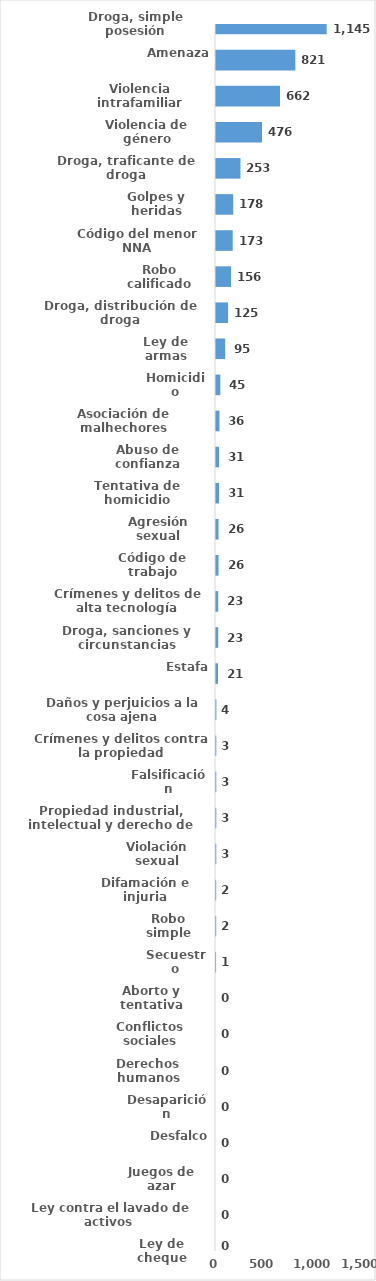
| Category | Series 0 |
|---|---|
| Droga, simple posesión | 1145 |
| Amenaza | 821 |
| Violencia intrafamiliar | 662 |
| Violencia de género | 476 |
| Droga, traficante de droga | 253 |
| Golpes y heridas | 178 |
| Código del menor NNA | 173 |
| Robo calificado | 156 |
| Droga, distribución de droga | 125 |
| Ley de armas | 95 |
| Homicidio | 45 |
| Asociación de malhechores | 36 |
| Abuso de confianza | 31 |
| Tentativa de homicidio | 31 |
| Agresión sexual | 26 |
| Código de trabajo | 26 |
| Crímenes y delitos de alta tecnología | 23 |
| Droga, sanciones y circunstancias agravantes | 23 |
| Estafa | 21 |
| Daños y perjuicios a la cosa ajena | 4 |
| Crímenes y delitos contra la propiedad | 3 |
| Falsificación | 3 |
| Propiedad industrial, intelectual y derecho de autor | 3 |
| Violación sexual | 3 |
| Difamación e injuria | 2 |
| Robo simple | 2 |
| Secuestro | 1 |
| Aborto y tentativa | 0 |
| Conflictos sociales | 0 |
| Derechos humanos | 0 |
| Desaparición | 0 |
| Desfalco | 0 |
| Juegos de azar | 0 |
| Ley contra el lavado de activos  | 0 |
| Ley de cheque | 0 |